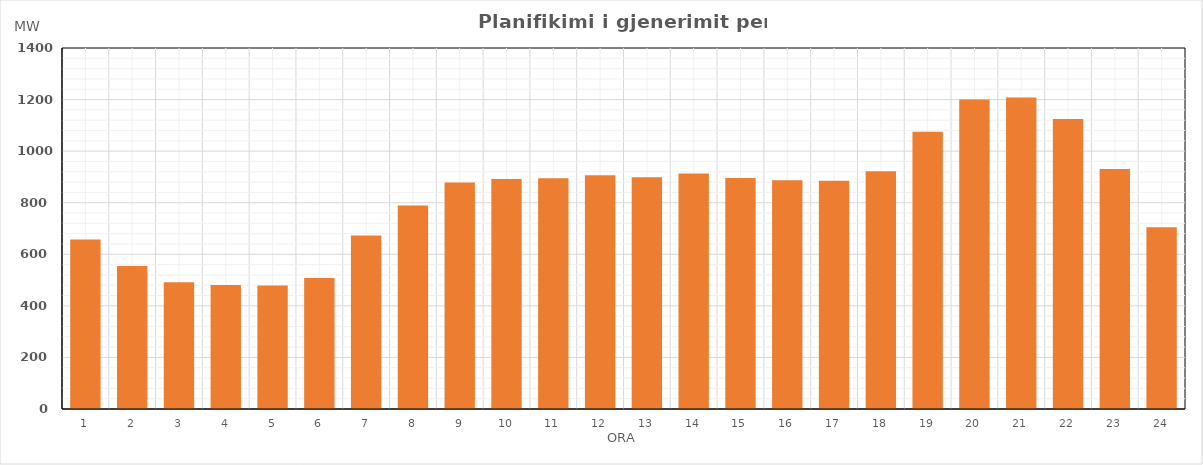
| Category | Max (MW) |
|---|---|
| 0 | 657.47 |
| 1 | 554.56 |
| 2 | 491.99 |
| 3 | 480.5 |
| 4 | 478.78 |
| 5 | 508.48 |
| 6 | 672.75 |
| 7 | 789.62 |
| 8 | 878.43 |
| 9 | 891.76 |
| 10 | 894.67 |
| 11 | 906.6 |
| 12 | 899.19 |
| 13 | 912.99 |
| 14 | 895.85 |
| 15 | 887.18 |
| 16 | 885.55 |
| 17 | 921.57 |
| 18 | 1075.07 |
| 19 | 1200.67 |
| 20 | 1208.06 |
| 21 | 1124.5 |
| 22 | 931.08 |
| 23 | 704.4 |